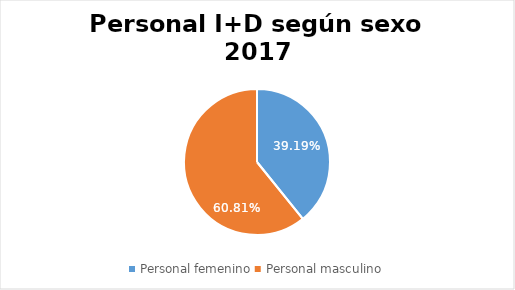
| Category | 2017 |
|---|---|
| Personal femenino | 0.392 |
| Personal masculino | 0.608 |